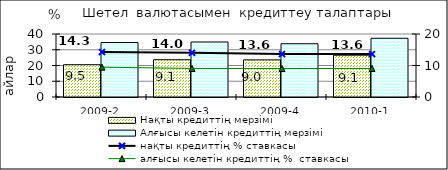
| Category | Нақты кредиттің мерзімі  | Алғысы келетін кредиттің мерзімі  |
|---|---|---|
| 2009-2 | 20.51 | 34.57 |
| 2009-3 | 23.67 | 34.93 |
| 2009-4 | 23.57 | 33.82 |
| 2010-1 | 26.54 | 37.3 |